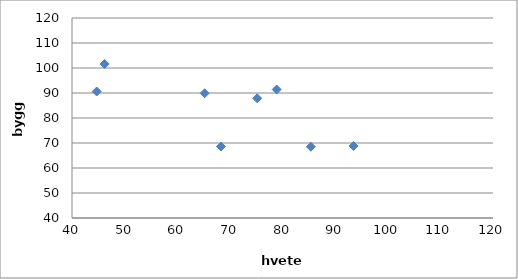
| Category | Series 0 |
|---|---|
| 46.2 | 101.6 |
| 44.7 | 90.6 |
| 65.2 | 89.9 |
| 78.9 | 91.4 |
| 75.2 | 87.9 |
| 68.3 | 68.6 |
| 85.4 | 68.5 |
| 93.5 | 68.8 |